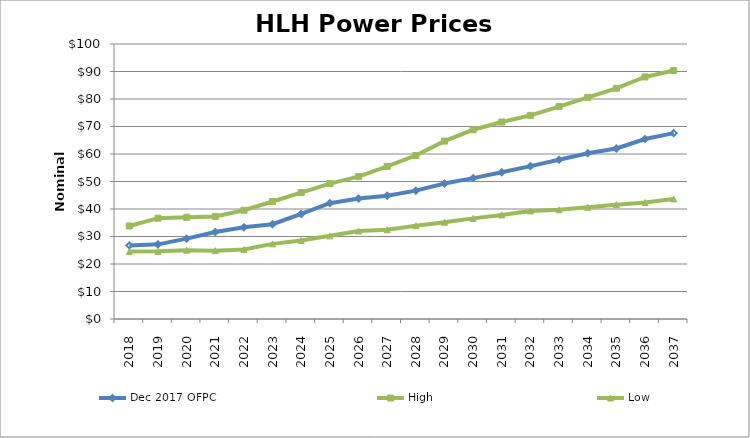
| Category | Dec 2017 OFPC | High | Low |
|---|---|---|---|
| 2018.0 | 26.759 | 33.825 | 24.528 |
| 2019.0 | 27.142 | 36.665 | 24.597 |
| 2020.0 | 29.213 | 36.997 | 25.038 |
| 2021.0 | 31.645 | 37.306 | 24.859 |
| 2022.0 | 33.343 | 39.545 | 25.291 |
| 2023.0 | 34.456 | 42.721 | 27.324 |
| 2024.0 | 38.214 | 45.986 | 28.572 |
| 2025.0 | 42.106 | 49.252 | 30.241 |
| 2026.0 | 43.782 | 51.784 | 31.982 |
| 2027.0 | 44.825 | 55.498 | 32.421 |
| 2028.0 | 46.668 | 59.468 | 33.938 |
| 2029.0 | 49.245 | 64.689 | 35.199 |
| 2030.0 | 51.226 | 68.812 | 36.587 |
| 2031.0 | 53.38 | 71.646 | 37.838 |
| 2032.0 | 55.596 | 74.055 | 39.285 |
| 2033.0 | 57.905 | 77.219 | 39.702 |
| 2034.0 | 60.281 | 80.61 | 40.616 |
| 2035.0 | 61.998 | 83.878 | 41.576 |
| 2036.0 | 65.454 | 88.021 | 42.33 |
| 2037.0 | 67.59 | 90.345 | 43.67 |